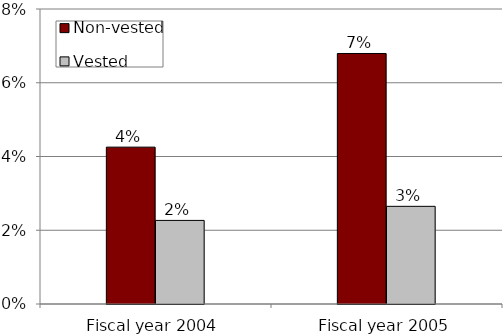
| Category | Non-vested | Vested |
|---|---|---|
| Fiscal year 2004 | 0.043 | 0.023 |
| Fiscal year 2005 | 0.068 | 0.026 |